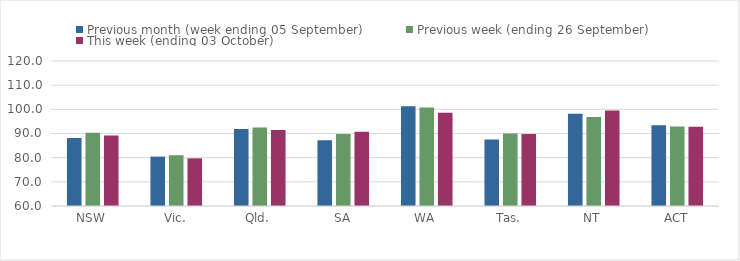
| Category | Previous month (week ending 05 September) | Previous week (ending 26 September) | This week (ending 03 October) |
|---|---|---|---|
| NSW | 88.11 | 90.31 | 89.2 |
| Vic. | 80.44 | 81 | 79.73 |
| Qld. | 91.85 | 92.51 | 91.47 |
| SA | 87.23 | 89.82 | 90.71 |
| WA | 101.27 | 100.76 | 98.54 |
| Tas. | 87.5 | 90.04 | 89.8 |
| NT | 98.14 | 96.79 | 99.47 |
| ACT | 93.43 | 92.91 | 92.84 |